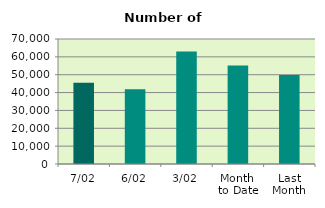
| Category | Series 0 |
|---|---|
| 7/02 | 45476 |
| 6/02 | 41844 |
| 3/02 | 63048 |
| Month 
to Date | 55119.2 |
| Last
Month | 49894.952 |